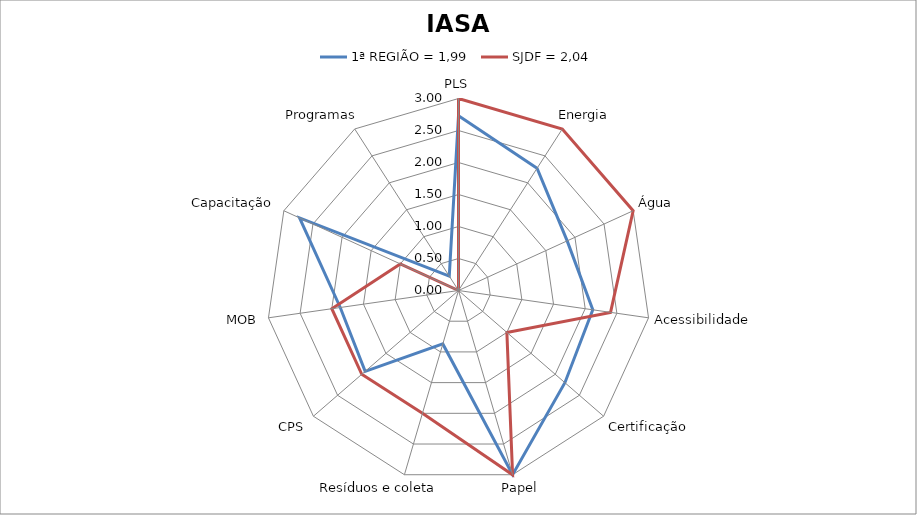
| Category | 1ª REGIÃO = 1,99 | SJDF = 2,04 |
|---|---|---|
| PLS | 2.73 | 3 |
| Energia | 2.27 | 3 |
| Água | 1.867 | 3 |
| Acessibilidade | 2.12 | 2.4 |
| Certificação | 2.2 | 1 |
| Papel | 3 | 3 |
| Resíduos e coleta | 0.87 | 2 |
| CPS | 1.93 | 2 |
| MOB | 1.867 | 2 |
| Capacitação | 2.73 | 1 |
| Programas | 0.267 | 0 |